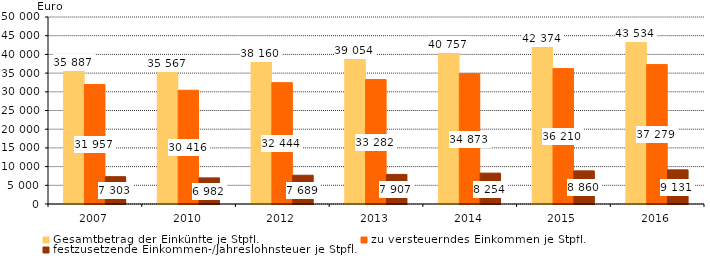
| Category | Gesamtbetrag der Einkünfte je Stpfl. | zu versteuerndes Einkommen je Stpfl. | festzusetzende Einkommen-/Jahreslohnsteuer je Stpfl. |
|---|---|---|---|
| 2007.0 | 35887 | 31957 | 7303 |
| 2010.0 | 35567 | 30416 | 6982 |
| 2012.0 | 38160 | 32444 | 7689 |
| 2013.0 | 39054 | 33282 | 7907 |
| 2014.0 | 40757 | 34873 | 8254 |
| 2015.0 | 42374 | 36210 | 8860 |
| 2016.0 | 43534 | 37279 | 9131 |